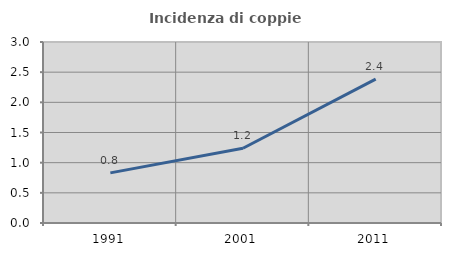
| Category | Incidenza di coppie miste |
|---|---|
| 1991.0 | 0.831 |
| 2001.0 | 1.238 |
| 2011.0 | 2.384 |